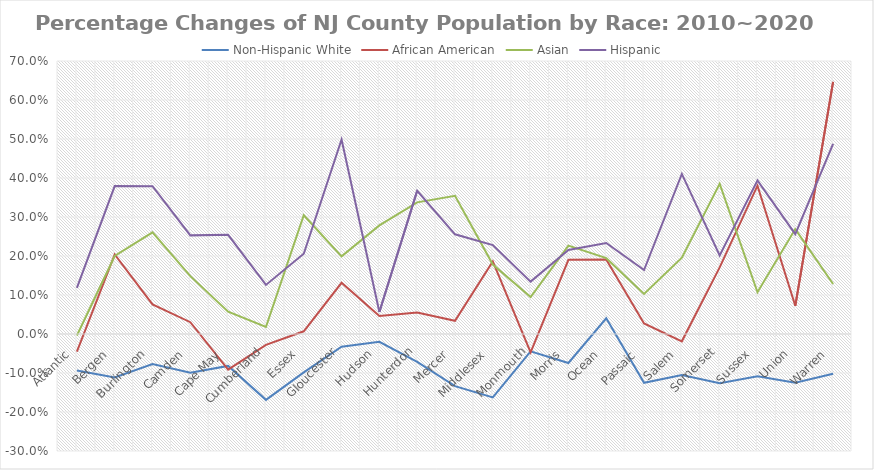
| Category | Non-Hispanic White | African American | Asian | Hispanic |
|---|---|---|---|---|
| Atlantic  | -0.094 | -0.045 | -0.004 | 0.118 |
| Bergen  | -0.111 | 0.204 | 0.2 | 0.379 |
| Burlington  | -0.077 | 0.076 | 0.261 | 0.379 |
| Camden  | -0.1 | 0.03 | 0.148 | 0.253 |
| Cape May  | -0.082 | -0.091 | 0.057 | 0.254 |
| Cumberland | -0.169 | -0.028 | 0.018 | 0.126 |
| Essex  | -0.099 | 0.007 | 0.305 | 0.206 |
| Gloucester | -0.033 | 0.131 | 0.199 | 0.499 |
| Hudson  | -0.02 | 0.046 | 0.278 | 0.056 |
| Hunterdon | -0.071 | 0.055 | 0.337 | 0.367 |
| Mercer  | -0.134 | 0.034 | 0.354 | 0.256 |
| Middlesex  | -0.163 | 0.186 | 0.178 | 0.228 |
| Monmouth | -0.044 | -0.047 | 0.095 | 0.134 |
| Morris  | -0.074 | 0.19 | 0.227 | 0.216 |
| Ocean  | 0.04 | 0.191 | 0.194 | 0.233 |
| Passaic  | -0.125 | 0.027 | 0.103 | 0.164 |
| Salem  | -0.105 | -0.019 | 0.196 | 0.41 |
| Somerset | -0.126 | 0.171 | 0.385 | 0.202 |
| Sussex  | -0.108 | 0.38 | 0.107 | 0.393 |
| Union  | -0.125 | 0.072 | 0.269 | 0.256 |
| Warren  | -0.102 | 0.647 | 0.128 | 0.488 |